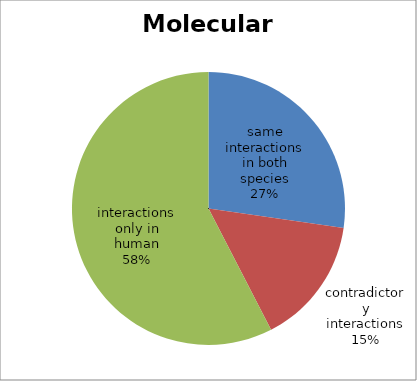
| Category | Series 0 |
|---|---|
| same interactions in both species | 9 |
| contradictory interactions | 5 |
| interactions only in human | 19 |